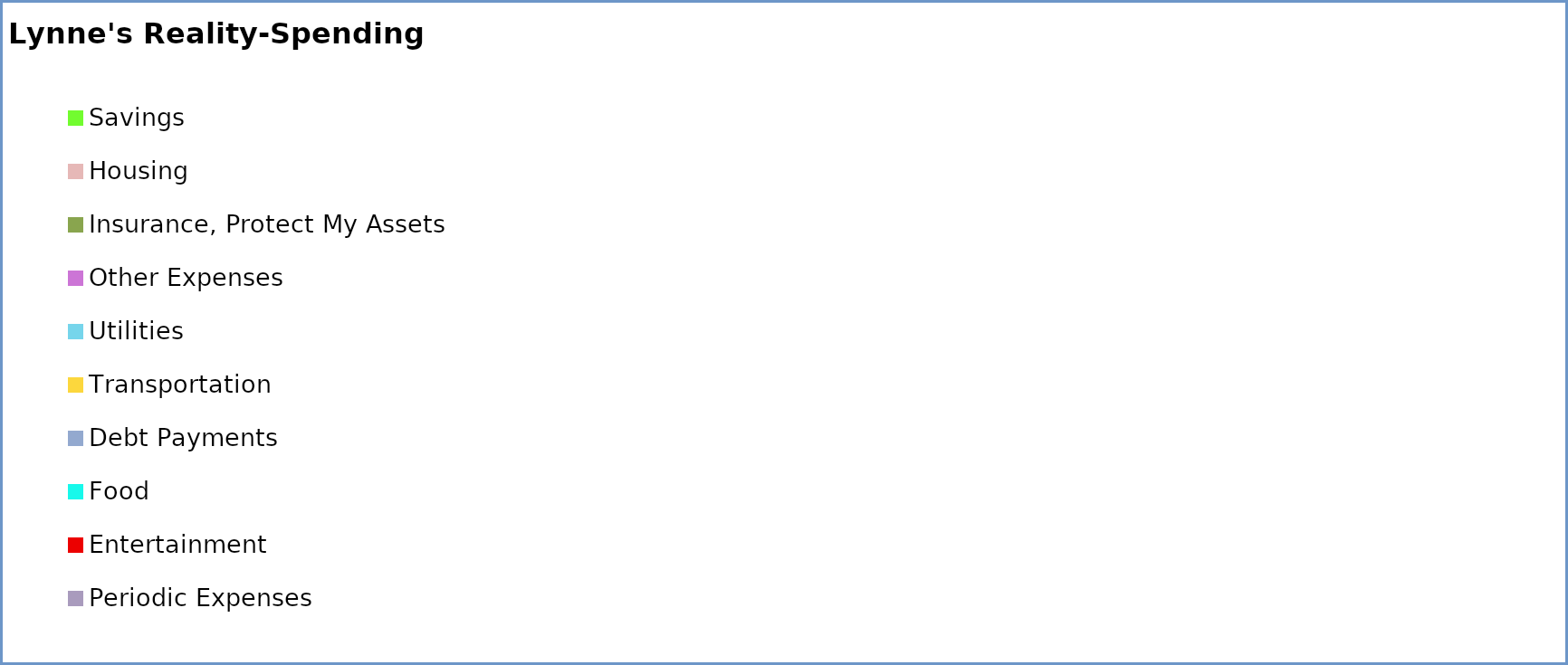
| Category | Series 0 | Series 1 |
|---|---|---|
| Savings | 0 | 0 |
| Housing | 0 | 0 |
| Insurance, Protect My Assets | 0 | 0 |
| Other Expenses | 0 | 0 |
| Utilities | 0 | 0 |
| Transportation | 0 | 0 |
| Debt Payments | 0 | 0 |
| Food | 0 | 0 |
| Entertainment | 0 | 0 |
| Periodic Expenses | 0 | 0 |